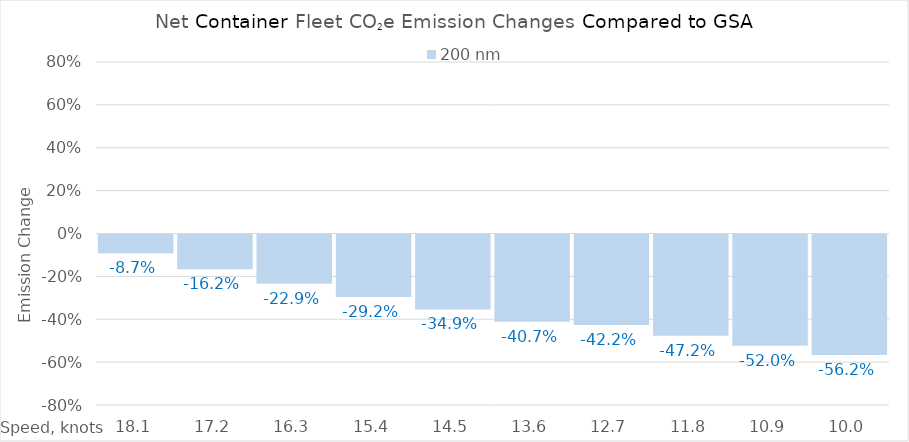
| Category | 200 |
|---|---|
| 18.1 | -0.087 |
| 17.200000000000003 | -0.162 |
| 16.300000000000004 | -0.229 |
| 15.400000000000004 | -0.292 |
| 14.500000000000004 | -0.349 |
| 13.600000000000003 | -0.407 |
| 12.700000000000003 | -0.422 |
| 11.800000000000002 | -0.472 |
| 10.900000000000002 | -0.52 |
| 10.000000000000002 | -0.562 |